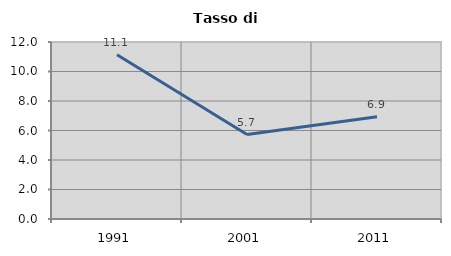
| Category | Tasso di disoccupazione   |
|---|---|
| 1991.0 | 11.137 |
| 2001.0 | 5.727 |
| 2011.0 | 6.938 |